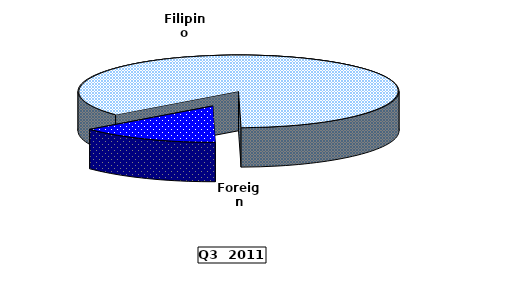
| Category | Series 0 |
|---|---|
| Filipino | 169.933 |
| Foreign | 28 |